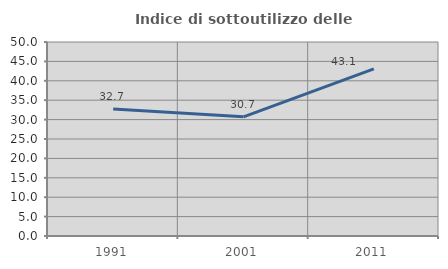
| Category | Indice di sottoutilizzo delle abitazioni  |
|---|---|
| 1991.0 | 32.749 |
| 2001.0 | 30.707 |
| 2011.0 | 43.073 |